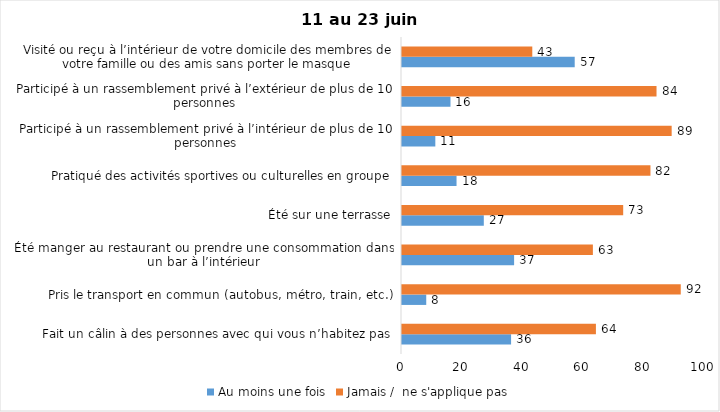
| Category | Au moins une fois | Jamais /  ne s'applique pas |
|---|---|---|
| Fait un câlin à des personnes avec qui vous n’habitez pas | 36 | 64 |
| Pris le transport en commun (autobus, métro, train, etc.) | 8 | 92 |
| Été manger au restaurant ou prendre une consommation dans un bar à l’intérieur | 37 | 63 |
| Été sur une terrasse | 27 | 73 |
| Pratiqué des activités sportives ou culturelles en groupe | 18 | 82 |
| Participé à un rassemblement privé à l’intérieur de plus de 10 personnes | 11 | 89 |
| Participé à un rassemblement privé à l’extérieur de plus de 10 personnes | 16 | 84 |
| Visité ou reçu à l’intérieur de votre domicile des membres de votre famille ou des amis sans porter le masque | 57 | 43 |